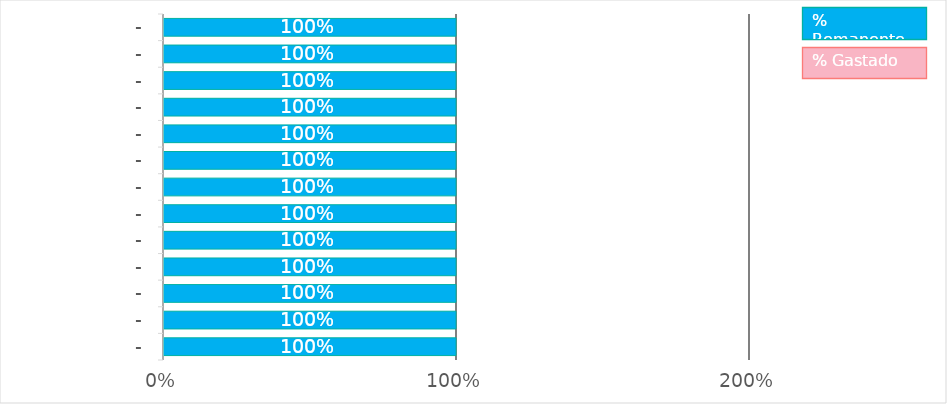
| Category | % Gastado | Presupuesto remanente |
|---|---|---|
| SUPERMERCADO | 0 | 1 |
| SERVICIOS BÁSICOS | 0 | 1 |
| EDUCACIÓN | 0 | 1 |
| OCIO | 0 | 1 |
| TRANSPORTE | 0 | 1 |
| VIVIENDA | 0 | 1 |
| SALUD | 0 | 1 |
| STREAMING | 0 | 1 |
| (otros) | 0 | 1 |
| (otros) | 0 | 1 |
| (otros) | 0 | 1 |
| (otros) | 0 | 1 |
| (otros) | 0 | 1 |